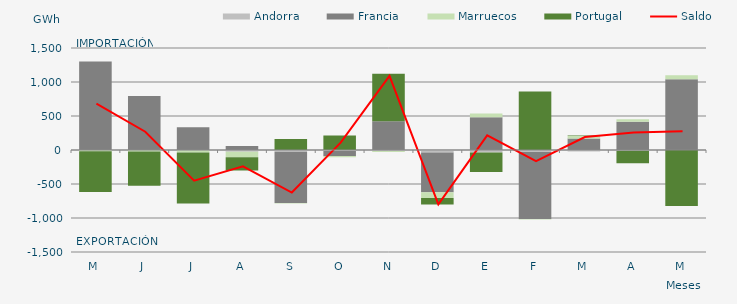
| Category | Andorra | Francia | Marruecos | Portugal |
|---|---|---|---|---|
| M | -1.245 | 1302.344 | -18.608 | -598.82 |
| J | -0.008 | 792.83 | -21.038 | -502.886 |
| J | -5.052 | 334.729 | -33.385 | -747.138 |
| A | -26.107 | 60.563 | -80.137 | -193.987 |
| S | -25.668 | -754.78 | -5.797 | 160.618 |
| O | -15.157 | -73.766 | -16.017 | 213.105 |
| N | -14.884 | 423.038 | -15.41 | 698.188 |
| D | -35.076 | -586.843 | -82.554 | -95.842 |
| E | -38.419 | 481.868 | 55.475 | -284.018 |
| F | -28.394 | -984.629 | -8.698 | 859.135 |
| M | -22.864 | 167.561 | 36.658 | 8.529 |
| A | -12.109 | 414.006 | 37.615 | -182.927 |
| M | 0 | 1041.33 | 58.27 | -825.3 |